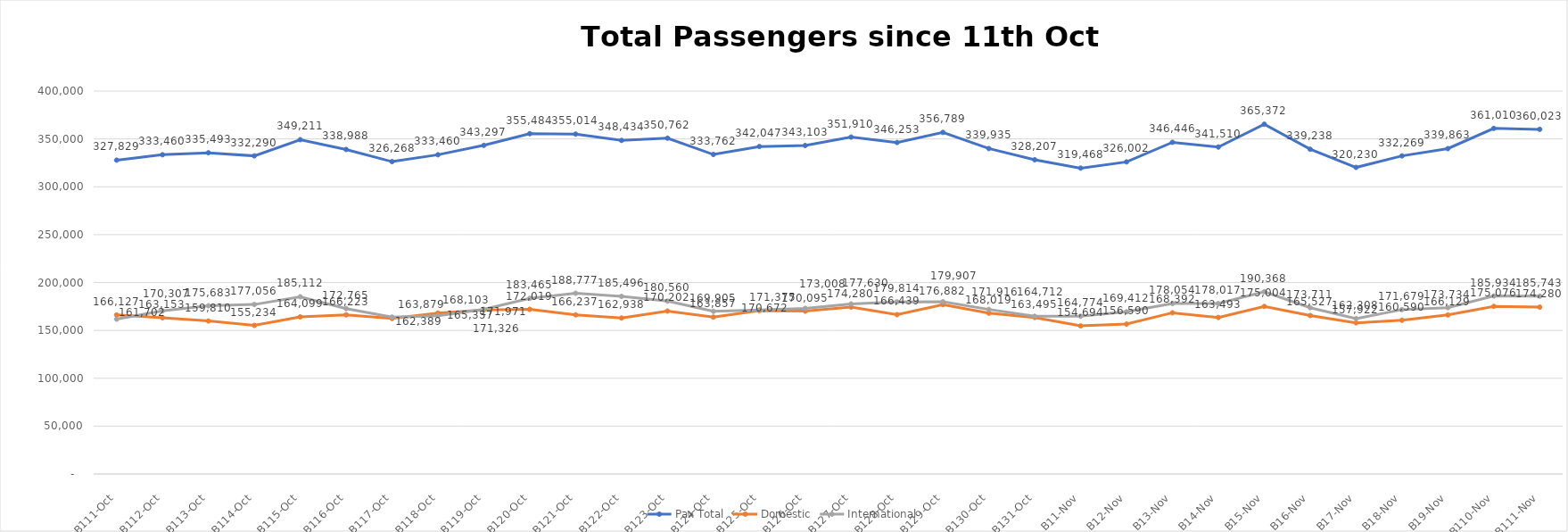
| Category | Pax Total | Domestic | International |
|---|---|---|---|
| 2023-10-11 | 327829 | 166127 | 161702 |
| 2023-10-12 | 333460 | 163153 | 170307 |
| 2023-10-13 | 335493 | 159810 | 175683 |
| 2023-10-14 | 332290 | 155234 | 177056 |
| 2023-10-15 | 349211 | 164099 | 185112 |
| 2023-10-16 | 338988 | 166223 | 172765 |
| 2023-10-17 | 326268 | 162389 | 163879 |
| 2023-10-18 | 333460 | 168103 | 165357 |
| 2023-10-19 | 343297 | 171326 | 171971 |
| 2023-10-20 | 355484 | 172019 | 183465 |
| 2023-10-21 | 355014 | 166237 | 188777 |
| 2023-10-22 | 348434 | 162938 | 185496 |
| 2023-10-23 | 350762 | 170202 | 180560 |
| 2023-10-24 | 333762 | 163857 | 169905 |
| 2023-10-25 | 342047 | 170672 | 171375 |
| 2023-10-26 | 343103 | 170095 | 173008 |
| 2023-10-27 | 351910 | 174280 | 177630 |
| 2023-10-28 | 346253 | 166439 | 179814 |
| 2023-10-29 | 356789 | 176882 | 179907 |
| 2023-10-30 | 339935 | 168019 | 171916 |
| 2023-10-31 | 328207 | 163495 | 164712 |
| 2023-11-01 | 319468 | 154694 | 164774 |
| 2023-11-02 | 326002 | 156590 | 169412 |
| 2023-11-03 | 346446 | 168392 | 178054 |
| 2023-11-04 | 341510 | 163493 | 178017 |
| 2023-11-05 | 365372 | 175004 | 190368 |
| 2023-11-06 | 339238 | 165527 | 173711 |
| 2023-11-07 | 320230 | 157922 | 162308 |
| 2023-11-08 | 332269 | 160590 | 171679 |
| 2023-11-09 | 339863 | 166129 | 173734 |
| 2023-11-10 | 361010 | 175076 | 185934 |
| 2023-11-11 | 360023 | 174280 | 185743 |